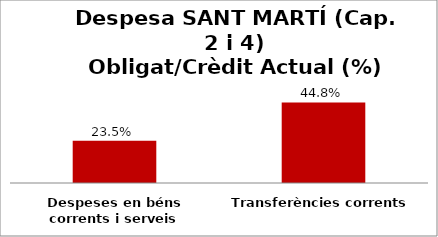
| Category | Series 0 |
|---|---|
| Despeses en béns corrents i serveis | 0.235 |
| Transferències corrents | 0.448 |